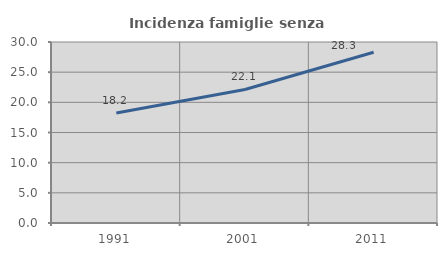
| Category | Incidenza famiglie senza nuclei |
|---|---|
| 1991.0 | 18.24 |
| 2001.0 | 22.13 |
| 2011.0 | 28.304 |